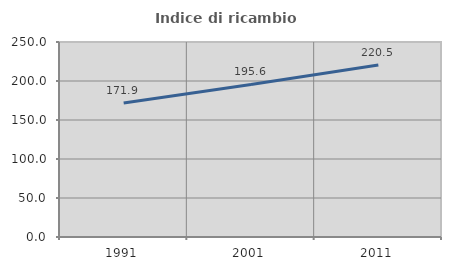
| Category | Indice di ricambio occupazionale  |
|---|---|
| 1991.0 | 171.93 |
| 2001.0 | 195.62 |
| 2011.0 | 220.472 |